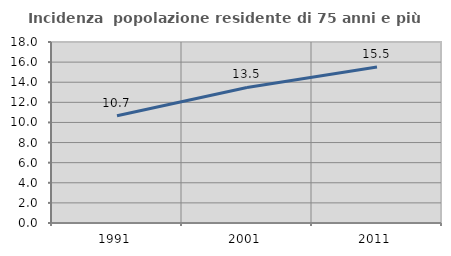
| Category | Incidenza  popolazione residente di 75 anni e più |
|---|---|
| 1991.0 | 10.663 |
| 2001.0 | 13.477 |
| 2011.0 | 15.519 |